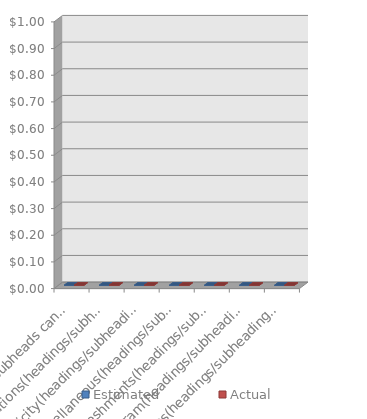
| Category | Estimated | Actual |
|---|---|---|
| Site(headings/subheads can be changed) | 0 | 0 |
| Decorations(headings/subheadings can be changed) | 0 | 0 |
| Publicity(headings/subheadings can be changed) | 0 | 0 |
| Miscellaneous(headings/subheadings can be changed) | 0 | 0 |
| Refreshments(headings/subheadings can be changed) | 0 | 0 |
| Program(headings/subheadings can be changed) | 0 | 0 |
| Prizes(headings/subheadings can be changed) | 0 | 0 |